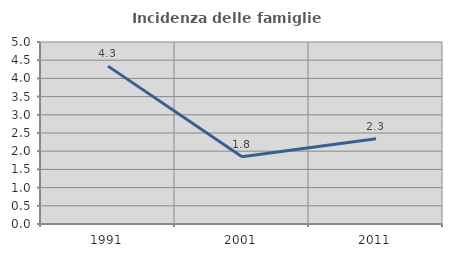
| Category | Incidenza delle famiglie numerose |
|---|---|
| 1991.0 | 4.337 |
| 2001.0 | 1.847 |
| 2011.0 | 2.344 |